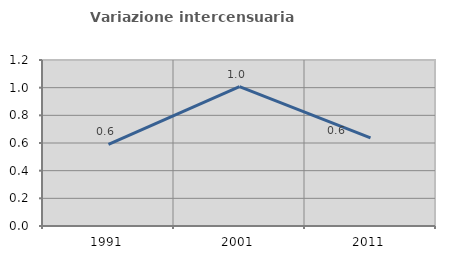
| Category | Variazione intercensuaria annua |
|---|---|
| 1991.0 | 0.59 |
| 2001.0 | 1.008 |
| 2011.0 | 0.637 |